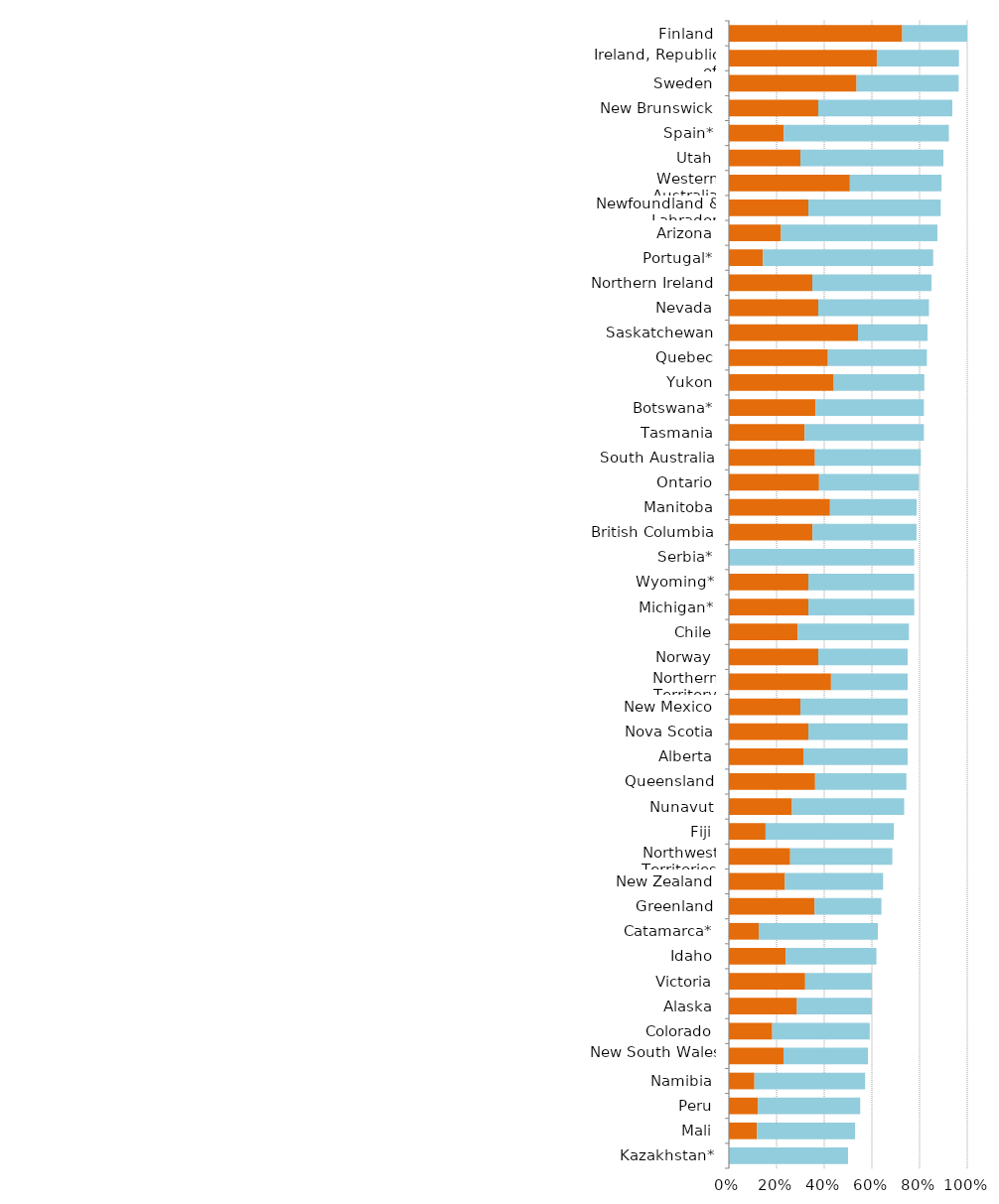
| Category | Series 0 | Series 1 |
|---|---|---|
| Kazakhstan* | 0 | 0.5 |
| Mali | 0.118 | 0.412 |
| Peru | 0.122 | 0.429 |
| Namibia | 0.107 | 0.464 |
| New South Wales | 0.229 | 0.354 |
| Colorado | 0.182 | 0.409 |
| Alaska | 0.286 | 0.314 |
| Victoria | 0.32 | 0.28 |
| Idaho | 0.238 | 0.381 |
| Catamarca* | 0.125 | 0.5 |
| Greenland | 0.36 | 0.28 |
| New Zealand | 0.235 | 0.412 |
| Northwest Territories | 0.257 | 0.429 |
| Fiji | 0.154 | 0.538 |
| Nunavut | 0.265 | 0.471 |
| Queensland | 0.362 | 0.383 |
| Alberta | 0.312 | 0.438 |
| Nova Scotia | 0.333 | 0.417 |
| New Mexico | 0.3 | 0.45 |
| Northern Territory | 0.429 | 0.321 |
| Norway | 0.375 | 0.375 |
| Chile | 0.289 | 0.467 |
| Michigan* | 0.333 | 0.444 |
| Wyoming* | 0.333 | 0.444 |
| Serbia* | 0 | 0.778 |
| British Columbia | 0.351 | 0.436 |
| Manitoba | 0.424 | 0.364 |
| Ontario | 0.378 | 0.419 |
| South Australia | 0.361 | 0.444 |
| Tasmania | 0.318 | 0.5 |
| Botswana* | 0.364 | 0.455 |
| Yukon | 0.44 | 0.38 |
| Quebec | 0.415 | 0.415 |
| Saskatchewan | 0.542 | 0.292 |
| Nevada | 0.375 | 0.464 |
| Northern Ireland | 0.35 | 0.5 |
| Portugal* | 0.143 | 0.714 |
| Arizona | 0.219 | 0.656 |
| Newfoundland & Labrador | 0.333 | 0.556 |
| Western Australia | 0.508 | 0.385 |
| Utah | 0.3 | 0.6 |
| Spain* | 0.231 | 0.692 |
| New Brunswick | 0.375 | 0.562 |
| Sweden | 0.536 | 0.429 |
| Ireland, Republic of | 0.621 | 0.345 |
| Finland | 0.727 | 0.273 |